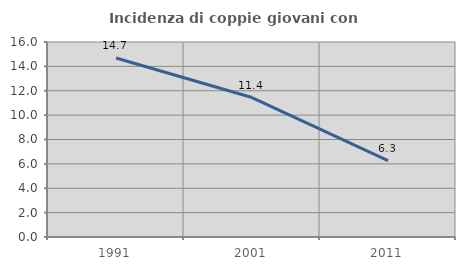
| Category | Incidenza di coppie giovani con figli |
|---|---|
| 1991.0 | 14.686 |
| 2001.0 | 11.442 |
| 2011.0 | 6.258 |